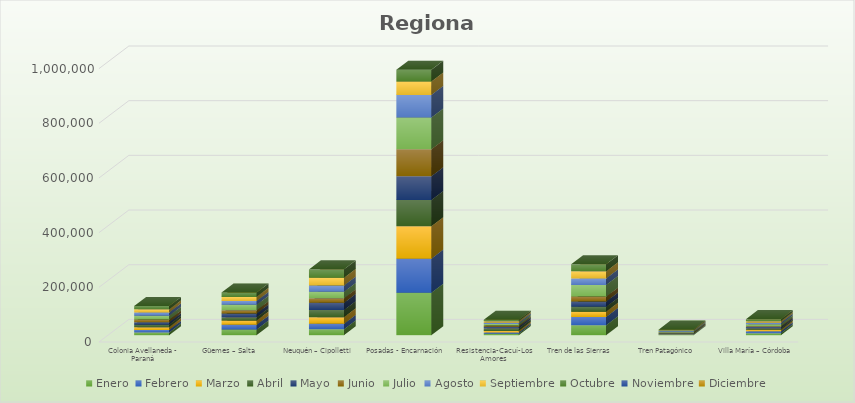
| Category | Enero | Febrero | Marzo | Abril | Mayo | Junio | Julio | Agosto | Septiembre | Octubre | Noviembre | Diciembre |
|---|---|---|---|---|---|---|---|---|---|---|---|---|
| Colonia Avellaneda - Paraná | 10021 | 9461 | 9946 | 9157 | 9042 | 9755 | 13933 | 12173 | 11050 | 12141 |  |  |
| Güemes – Salta | 20707 | 17423 | 15440 | 11664 | 14120 | 11847 | 19853 | 14122 | 15008 | 15781 |  |  |
| Neuquén – Cipolletti | 21642 | 19975 | 24216 | 26278 | 26329 | 16863 | 23405 | 23124 | 28016 | 30917 |  |  |
| Posadas - Encarnación | 155033 | 124991 | 118258 | 95871 | 87560 | 98304 | 115983 | 83026 | 48915 | 42945 |  |  |
| Resistencia-Cacuí-Los Amores | 5471 | 4557 | 5588 | 9116 | 6205 | 4497 | 5507 | 4744 | 5411 | 5629 |  |  |
| Tren de las Sierras | 36682 | 30315 | 18952 | 17779 | 19598 | 17907 | 42776 | 23902 | 25836 | 25607 |  |  |
| Tren Patagónico | 2070 | 1795 | 1773 | 1459 | 1059 | 1804 | 2932 | 2294 | 2236 | 2853 |  |  |
| Villa María – Córdoba | 7458 | 6901 | 5230 | 5330 | 4704 | 3107 | 7280 | 5877 | 5501 | 7420 |  |  |